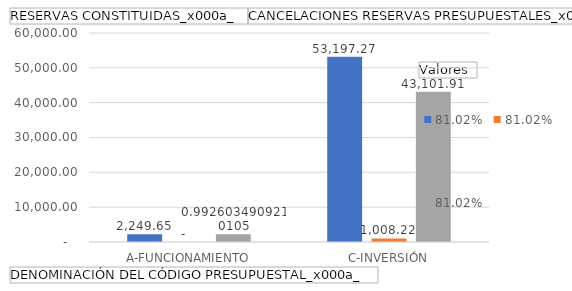
| Category | RESERVAS CONSTITUIDAS
 | CANCELACIONES RESERVAS PRESUPUESTALES
  | PAGOS
ACUMULADOS
 |
|---|---|---|---|
| A-FUNCIONAMIENTO | 2249.649 | 0 | 2233.009 |
| C-INVERSIÓN | 53197.266 | 1008.219 | 43101.909 |